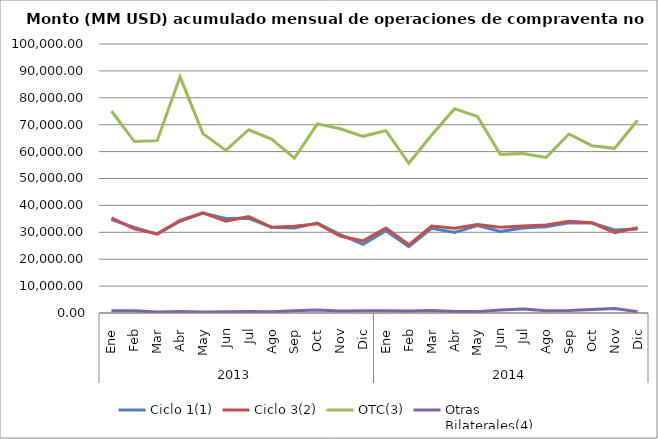
| Category | Ciclo 1(1) | Ciclo 3(2) | OTC(3) | Otras
Bilaterales(4) |
|---|---|---|---|---|
| 0 | 34736.674 | 35336.778 | 75100.994 | 862.558 |
| 1 | 31837.301 | 31276.084 | 63735.014 | 835.426 |
| 2 | 29308.645 | 29417.861 | 64070.642 | 371.583 |
| 3 | 34083.554 | 34428.23 | 87796.406 | 540.738 |
| 4 | 37163.38 | 37242.543 | 66687.424 | 368.797 |
| 5 | 35163.266 | 34165.361 | 60467.987 | 473.52 |
| 6 | 35197.057 | 35828.881 | 68121.887 | 537.978 |
| 7 | 31913.776 | 31846.832 | 64630.867 | 477.656 |
| 8 | 31601.855 | 32260.646 | 57599.123 | 864.94 |
| 9 | 33455.872 | 33201.092 | 70316.044 | 1074.052 |
| 10 | 29141.89 | 28620.849 | 68482.193 | 758.559 |
| 11 | 25532.796 | 26816.016 | 65678.317 | 842.072 |
| 12 | 30609.998 | 31608.391 | 67807.808 | 838.473 |
| 13 | 24661.445 | 25355.64 | 55646.165 | 717.558 |
| 14 | 31490.456 | 32327.003 | 66188.016 | 905.778 |
| 15 | 29968.466 | 31511.409 | 75953.393 | 552.114 |
| 16 | 32511.8 | 32893.552 | 73041.006 | 512.251 |
| 17 | 30347.815 | 31837.962 | 58974.75 | 1157.814 |
| 18 | 31634.299 | 32380.251 | 59280.214 | 1471.651 |
| 19 | 32084.514 | 32686.117 | 57820.266 | 827.326 |
| 20 | 33552.254 | 34123.345 | 66553.88 | 951.31 |
| 21 | 33462.158 | 33540.142 | 62195.497 | 1269.478 |
| 22 | 30879.707 | 29832.987 | 61221.909 | 1690.363 |
| 23 | 31229.235 | 31666.944 | 71675.309 | 502.95 |